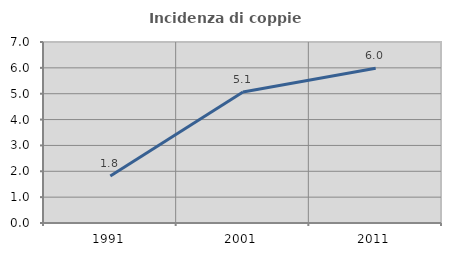
| Category | Incidenza di coppie miste |
|---|---|
| 1991.0 | 1.818 |
| 2001.0 | 5.069 |
| 2011.0 | 5.983 |